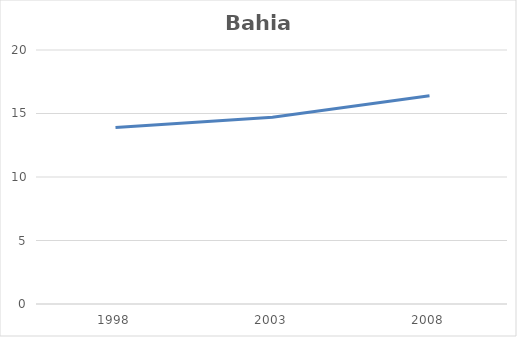
| Category | Bahia |
|---|---|
| 1998.0 | 13.9 |
| 2003.0 | 14.7 |
| 2008.0 | 16.4 |